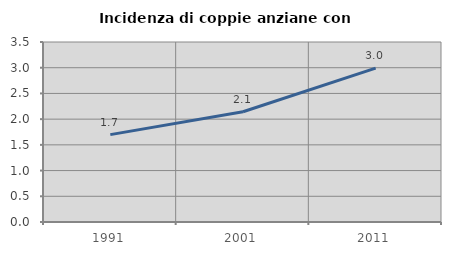
| Category | Incidenza di coppie anziane con figli |
|---|---|
| 1991.0 | 1.699 |
| 2001.0 | 2.143 |
| 2011.0 | 2.993 |